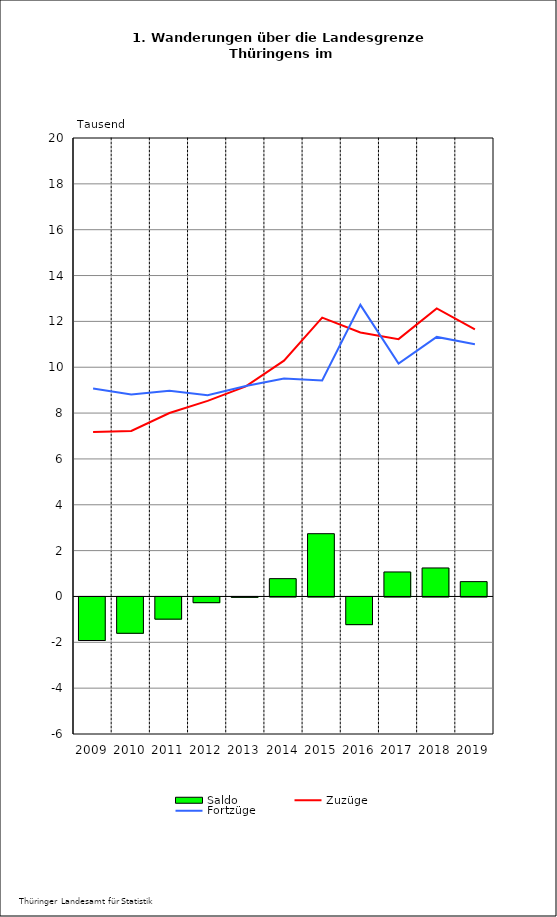
| Category | Saldo |
|---|---|
| 2009.0 | -1.9 |
| 2010.0 | -1.585 |
| 2011.0 | -0.968 |
| 2012.0 | -0.249 |
| 2013.0 | -0.016 |
| 2014.0 | 0.777 |
| 2015.0 | 2.738 |
| 2016.0 | -1.207 |
| 2017.0 | 1.069 |
| 2018.0 | 1.243 |
| 2019.0 | 0.647 |